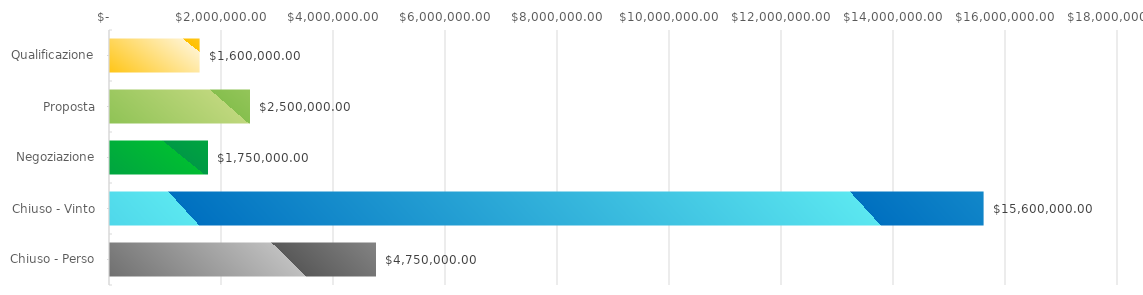
| Category | Series 0 |
|---|---|
| Qualificazione | 1600000 |
| Proposta | 2500000 |
| Negoziazione | 1750000 |
| Chiuso - Vinto | 15600000 |
| Chiuso - Perso | 4750000 |